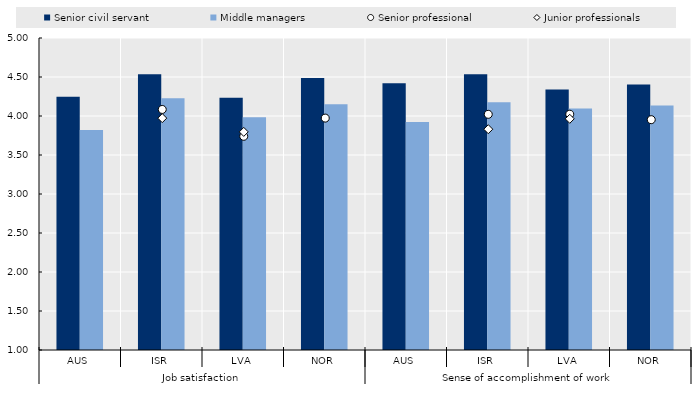
| Category | Senior civil servant | Middle managers |
|---|---|---|
| 0 | 4.245 | 3.82 |
| 1 | 4.536 | 4.228 |
| 2 | 4.234 | 3.983 |
| 3 | 4.486 | 4.15 |
| 4 | 4.421 | 3.922 |
| 5 | 4.534 | 4.175 |
| 6 | 4.338 | 4.096 |
| 7 | 4.404 | 4.133 |